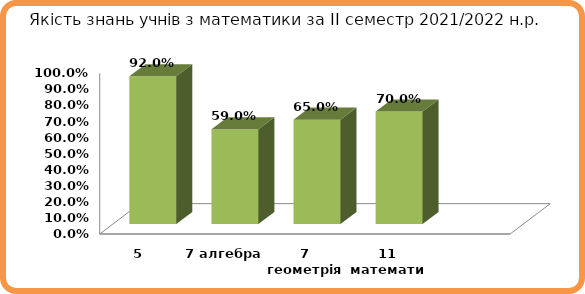
| Category | Series 0 |
|---|---|
| 5 | 0.92 |
| 7 алгебра | 0.59 |
| 7 геометрія | 0.65 |
| 11 математика | 0.7 |